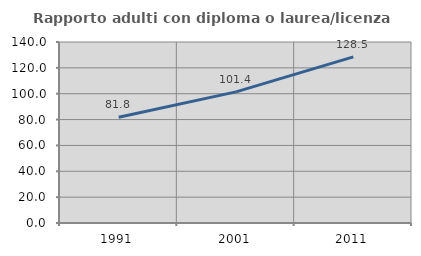
| Category | Rapporto adulti con diploma o laurea/licenza media  |
|---|---|
| 1991.0 | 81.818 |
| 2001.0 | 101.407 |
| 2011.0 | 128.509 |